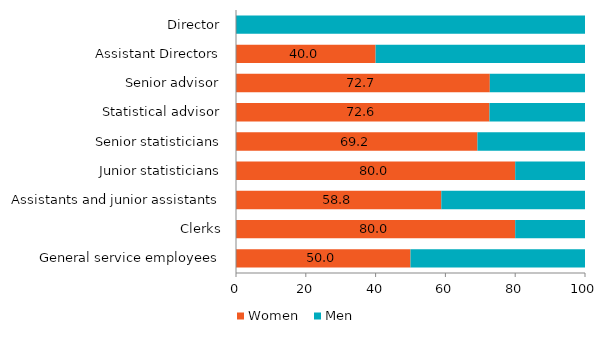
| Category | Women  | Men  |
|---|---|---|
| General service employees | 50 | 50 |
| Clerks | 80 | 20 |
| Assistants and junior assistants | 58.824 | 41.176 |
| Junior statisticians | 80 | 20 |
| Senior statisticians | 69.182 | 30.818 |
| Statistical advisor | 72.632 | 27.368 |
| Senior advisor | 72.727 | 27.273 |
| Assistant Directors | 40 | 60 |
| Director | 0 | 100 |